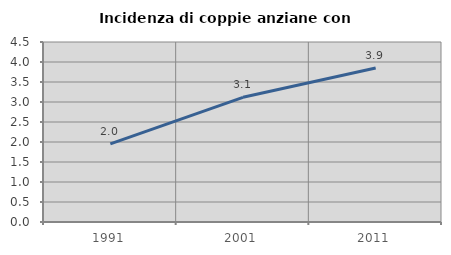
| Category | Incidenza di coppie anziane con figli |
|---|---|
| 1991.0 | 1.951 |
| 2001.0 | 3.118 |
| 2011.0 | 3.852 |